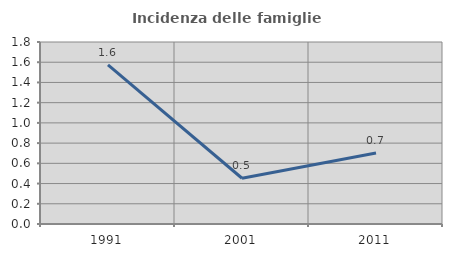
| Category | Incidenza delle famiglie numerose |
|---|---|
| 1991.0 | 1.575 |
| 2001.0 | 0.452 |
| 2011.0 | 0.701 |